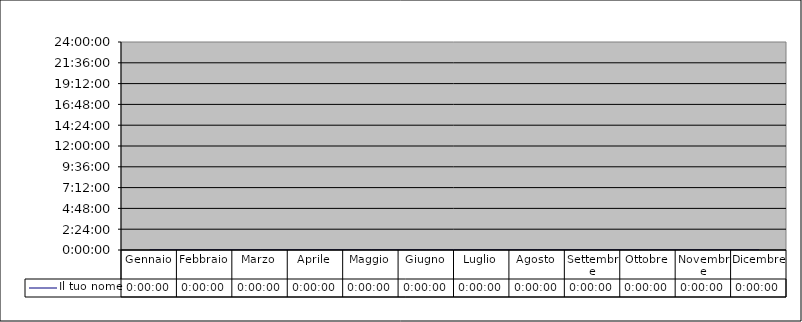
| Category | Il tuo nome |
|---|---|
| Gennaio | 0 |
| Febbraio | 0 |
| Marzo | 0 |
| Aprile | 0 |
| Maggio | 0 |
| Giugno | 0 |
| Luglio | 0 |
| Agosto | 0 |
| Settembre | 0 |
| Ottobre | 0 |
| Novembre | 0 |
| Dicembre | 0 |